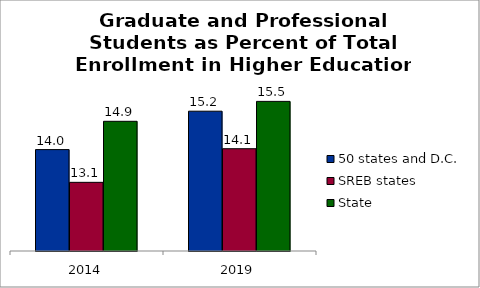
| Category | 50 states and D.C. | SREB states | State |
|---|---|---|---|
| 2014.0 | 14.036 | 13.056 | 14.883 |
| 2019.0 | 15.186 | 14.062 | 15.48 |